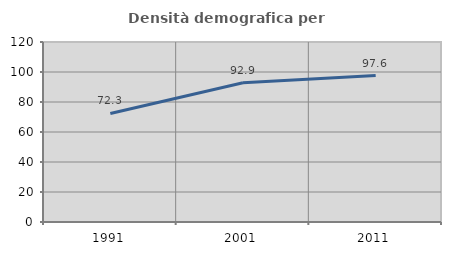
| Category | Densità demografica |
|---|---|
| 1991.0 | 72.335 |
| 2001.0 | 92.857 |
| 2011.0 | 97.601 |